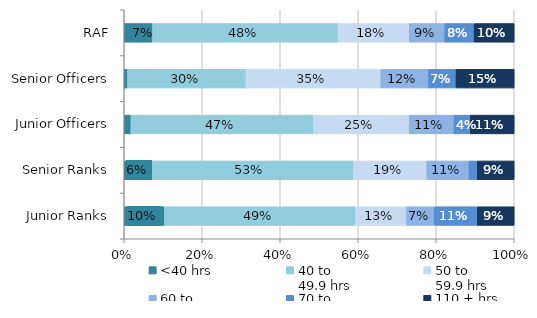
| Category | <40 hrs | 40 to 
49.9 hrs | 50 to 
59.9 hrs | 60 to 
69.9 hrs | 70 to 
109.9 hrs | 110 + hrs |
|---|---|---|---|---|---|---|
| RAF | 0.073 | 0.476 | 0.183 | 0.091 | 0.075 | 0.103 |
| Senior Officers | 0.008 | 0.304 | 0.346 | 0.122 | 0.07 | 0.149 |
| Junior Officers | 0.017 | 0.468 | 0.246 | 0.115 | 0.042 | 0.112 |
| Senior Ranks | 0.062 | 0.526 | 0.188 | 0.108 | 0.021 | 0.095 |
| Junior Ranks | 0.103 | 0.489 | 0.132 | 0.071 | 0.11 | 0.095 |